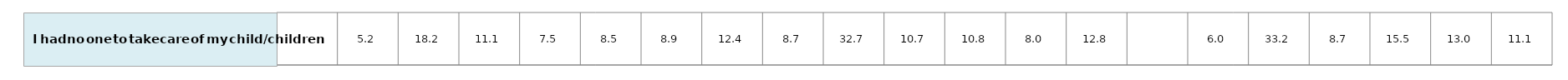
| Category | Series 0 |
|---|---|
| nan | 1 |
| 5.17150713406743 | 1 |
| 18.22374945479982 | 1 |
| 11.10909793525246 | 1 |
| 7.48054078737235 | 1 |
| 8.48202027341809 | 1 |
| 8.92446405958218 | 1 |
| 12.35227982806257 | 1 |
| 8.68964705827971 | 1 |
| 32.66409986795311 | 1 |
| 10.67223865835317 | 1 |
| 10.78727295772093 | 1 |
| 8.0029452073877 | 1 |
| 12.78508326273818 | 1 |
| nan | 1 |
| 6.0152095129028496 | 1 |
| 33.24343328047104 | 1 |
| 8.65731045432208 | 1 |
| 15.49787774705198 | 1 |
| 13.04153661369333 | 1 |
| 11.11626789859646 | 1 |